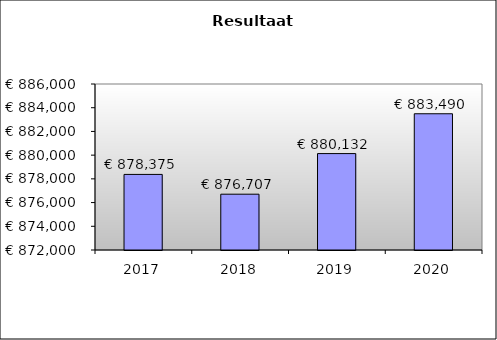
| Category | Series 0 |
|---|---|
| 2017.0 | 878375.367 |
| 2018.0 | 876706.631 |
| 2019.0 | 880131.823 |
| 2020.0 | 883490.414 |